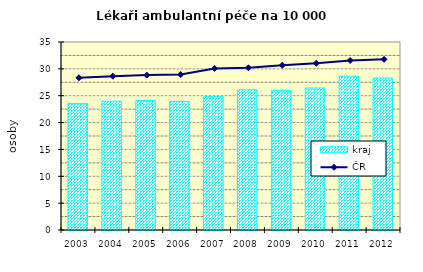
| Category | kraj |
|---|---|
| 2003.0 | 23.571 |
| 2004.0 | 23.982 |
| 2005.0 | 24.111 |
| 2006.0 | 23.94 |
| 2007.0 | 24.831 |
| 2008.0 | 26.105 |
| 2009.0 | 25.945 |
| 2010.0 | 26.438 |
| 2011.0 | 28.636 |
| 2012.0 | 28.303 |